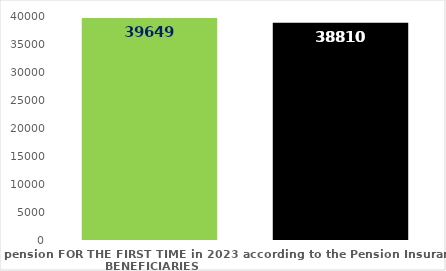
| Category | broj korisnika |
|---|---|
| Pension beneficiaries entitled to pension FOR THE FIRST TIME in 2023 according to the Pension Insurance Act  - NEW BENEFICIARIES | 39649 |
| Pension beneficiaries whose pension entitlement ceased in 2023  -  death caused,   
and who were retired according to the Pension Insurance Act   | 38810 |